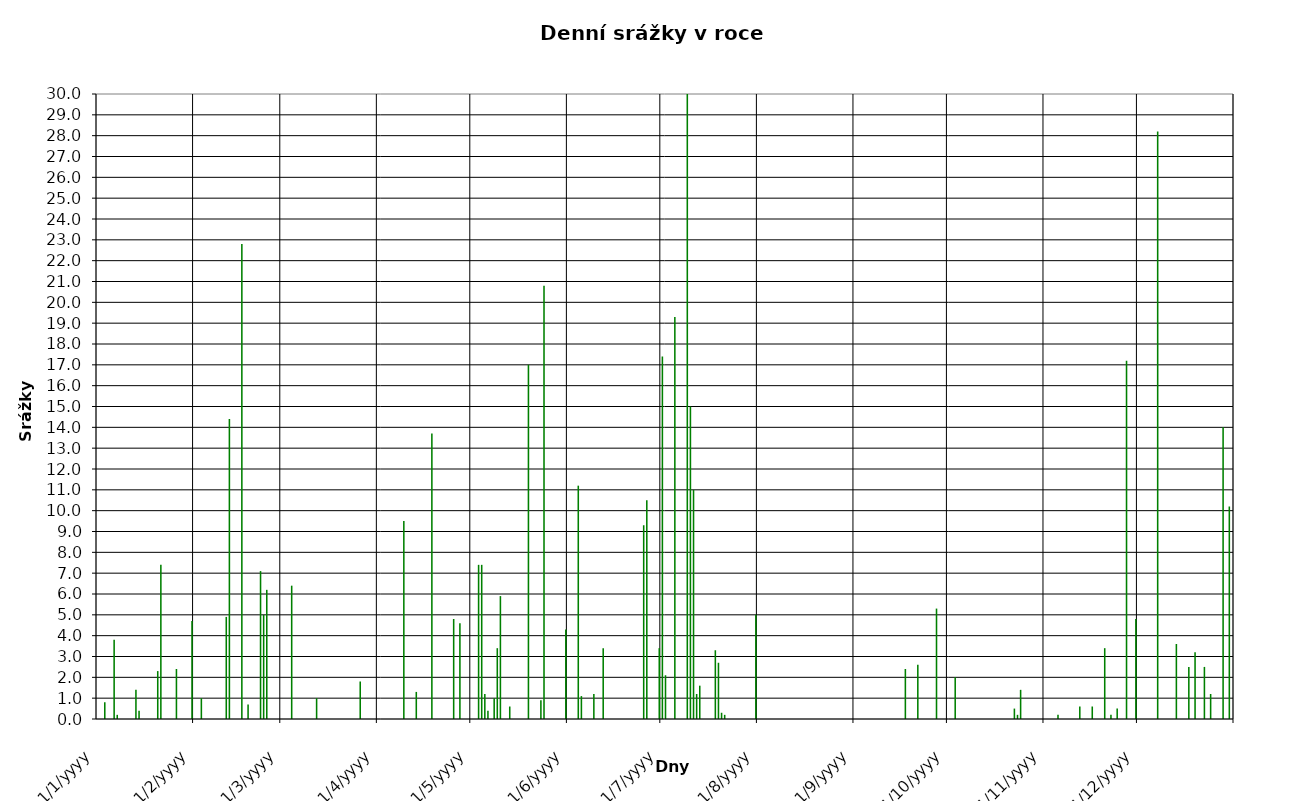
| Category | Series 0 |
|---|---|
| 2005-01-01 | 0 |
| 2005-01-02 | 0 |
| 2005-01-03 | 0.8 |
| 2005-01-04 | 0 |
| 2005-01-05 | 0 |
| 2005-01-06 | 3.8 |
| 2005-01-07 | 0.2 |
| 2005-01-08 | 0 |
| 2005-01-09 | 0 |
| 2005-01-10 | 0 |
| 2005-01-11 | 0 |
| 2005-01-12 | 0 |
| 2005-01-13 | 1.4 |
| 2005-01-14 | 0.4 |
| 2005-01-15 | 0 |
| 2005-01-16 | 0 |
| 2005-01-17 | 0 |
| 2005-01-18 | 0 |
| 2005-01-19 | 0 |
| 2005-01-20 | 2.3 |
| 2005-01-21 | 7.4 |
| 2005-01-22 | 0 |
| 2005-01-23 | 0 |
| 2005-01-24 | 0 |
| 2005-01-25 | 0 |
| 2005-01-26 | 2.4 |
| 2005-01-27 | 0 |
| 2005-01-28 | 0 |
| 2005-01-29 | 0 |
| 2005-01-30 | 0 |
| 2005-01-31 | 4.7 |
| 2005-02-01 | 0 |
| 2005-02-02 | 0 |
| 2005-02-03 | 1 |
| 2005-02-04 | 0 |
| 2005-02-05 | 0 |
| 2005-02-06 | 0 |
| 2005-02-07 | 0 |
| 2005-02-08 | 0 |
| 2005-02-09 | 0 |
| 2005-02-10 | 0 |
| 2005-02-11 | 4.9 |
| 2005-02-12 | 14.4 |
| 2005-02-13 | 0 |
| 2005-02-14 | 0 |
| 2005-02-15 | 0 |
| 2005-02-16 | 22.8 |
| 2005-02-17 | 0 |
| 2005-02-18 | 0.7 |
| 2005-02-19 | 0 |
| 2005-02-20 | 0 |
| 2005-02-21 | 0 |
| 2005-02-22 | 7.1 |
| 2005-02-23 | 5 |
| 2005-02-24 | 6.2 |
| 2005-02-25 | 0 |
| 2005-02-26 | 0 |
| 2005-02-27 | 0 |
| 2005-02-28 | 0 |
| 2005-03-01 | 0 |
| 2005-03-02 | 0 |
| 2005-03-03 | 0 |
| 2005-03-04 | 6.4 |
| 2005-03-05 | 0 |
| 2005-03-06 | 0 |
| 2005-03-07 | 0 |
| 2005-03-08 | 0 |
| 2005-03-09 | 0 |
| 2005-03-10 | 0 |
| 2005-03-11 | 0 |
| 2005-03-12 | 1 |
| 2005-03-13 | 0 |
| 2005-03-14 | 0 |
| 2005-03-15 | 0 |
| 2005-03-16 | 0 |
| 2005-03-17 | 0 |
| 2005-03-18 | 0 |
| 2005-03-19 | 0 |
| 2005-03-20 | 0 |
| 2005-03-21 | 0 |
| 2005-03-22 | 0 |
| 2005-03-23 | 0 |
| 2005-03-24 | 0 |
| 2005-03-25 | 0 |
| 2005-03-26 | 1.8 |
| 2005-03-27 | 0 |
| 2005-03-28 | 0 |
| 2005-03-29 | 0 |
| 2005-03-30 | 0 |
| 2005-03-31 | 0 |
| 2005-04-01 | 0 |
| 2005-04-02 | 0 |
| 2005-04-03 | 0 |
| 2005-04-04 | 0 |
| 2005-04-05 | 0 |
| 2005-04-06 | 0 |
| 2005-04-07 | 0 |
| 2005-04-08 | 0 |
| 2005-04-09 | 9.5 |
| 2005-04-10 | 0 |
| 2005-04-11 | 0 |
| 2005-04-12 | 0 |
| 2005-04-13 | 1.3 |
| 2005-04-14 | 0 |
| 2005-04-15 | 0 |
| 2005-04-16 | 0 |
| 2005-04-17 | 0 |
| 2005-04-18 | 13.7 |
| 2005-04-19 | 0 |
| 2005-04-20 | 0 |
| 2005-04-21 | 0 |
| 2005-04-22 | 0 |
| 2005-04-23 | 0 |
| 2005-04-24 | 0 |
| 2005-04-25 | 4.8 |
| 2005-04-26 | 0 |
| 2005-04-27 | 4.6 |
| 2005-04-28 | 0 |
| 2005-04-29 | 0 |
| 2005-04-30 | 0 |
| 2005-05-01 | 0 |
| 2005-05-02 | 0 |
| 2005-05-03 | 7.4 |
| 2005-05-04 | 7.4 |
| 2005-05-05 | 1.2 |
| 2005-05-06 | 0.4 |
| 2005-05-07 | 0 |
| 2005-05-08 | 1 |
| 2005-05-09 | 3.4 |
| 2005-05-10 | 5.9 |
| 2005-05-11 | 0 |
| 2005-05-12 | 0 |
| 2005-05-13 | 0.6 |
| 2005-05-14 | 0 |
| 2005-05-15 | 0 |
| 2005-05-16 | 0 |
| 2005-05-17 | 0 |
| 2005-05-18 | 0 |
| 2005-05-19 | 17 |
| 2005-05-20 | 0 |
| 2005-05-21 | 0 |
| 2005-05-22 | 0 |
| 2005-05-23 | 0.9 |
| 2005-05-24 | 20.8 |
| 2005-05-25 | 0 |
| 2005-05-26 | 0 |
| 2005-05-27 | 0 |
| 2005-05-28 | 0 |
| 2005-05-29 | 0 |
| 2005-05-30 | 0 |
| 2005-05-31 | 4.3 |
| 2005-06-01 | 0 |
| 2005-06-02 | 0 |
| 2005-06-03 | 0 |
| 2005-06-04 | 11.2 |
| 2005-06-05 | 1.1 |
| 2005-06-06 | 0 |
| 2005-06-07 | 0 |
| 2005-06-08 | 0 |
| 2005-06-09 | 1.2 |
| 2005-06-10 | 0 |
| 2005-06-11 | 0 |
| 2005-06-12 | 3.4 |
| 2005-06-13 | 0 |
| 2005-06-14 | 0 |
| 2005-06-15 | 0 |
| 2005-06-16 | 0 |
| 2005-06-17 | 0 |
| 2005-06-18 | 0 |
| 2005-06-19 | 0 |
| 2005-06-20 | 0 |
| 2005-06-21 | 0 |
| 2005-06-22 | 0 |
| 2005-06-23 | 0 |
| 2005-06-24 | 0 |
| 2005-06-25 | 9.3 |
| 2005-06-26 | 10.5 |
| 2005-06-27 | 0 |
| 2005-06-28 | 0 |
| 2005-06-29 | 0 |
| 2005-06-30 | 3.4 |
| 2005-07-01 | 17.4 |
| 2005-07-02 | 2.1 |
| 2005-07-03 | 0 |
| 2005-07-04 | 0 |
| 2005-07-05 | 19.3 |
| 2005-07-06 | 0 |
| 2005-07-07 | 0 |
| 2005-07-08 | 0 |
| 2005-07-09 | 30 |
| 2005-07-10 | 15 |
| 2005-07-11 | 11 |
| 2005-07-12 | 1.2 |
| 2005-07-13 | 1.6 |
| 2005-07-14 | 0 |
| 2005-07-15 | 0 |
| 2005-07-16 | 0 |
| 2005-07-17 | 0 |
| 2005-07-18 | 3.3 |
| 2005-07-19 | 2.7 |
| 2005-07-20 | 0.3 |
| 2005-07-21 | 0.2 |
| 2005-07-22 | 0 |
| 2005-07-23 | 0 |
| 2005-07-24 | 0 |
| 2005-07-25 | 0 |
| 2005-07-26 | 0 |
| 2005-07-27 | 0 |
| 2005-07-28 | 0 |
| 2005-07-29 | 0 |
| 2005-07-30 | 0 |
| 2005-07-31 | 5 |
| 2005-08-01 | 0 |
| 2004-08-02 | 0 |
| 2004-08-03 | 12.4 |
| 2004-08-04 | 1.4 |
| 2004-08-05 | 0 |
| 2004-08-06 | 0 |
| 2004-08-07 | 0 |
| 2004-08-08 | 0 |
| 2004-08-09 | 0 |
| 2004-08-10 | 0 |
| 2004-08-11 | 0 |
| 2004-08-12 | 0 |
| 2004-08-13 | 0 |
| 2004-08-14 | 0 |
| 2004-08-15 | 22.8 |
| 2004-08-16 | 24.6 |
| 2004-08-17 | 0.1 |
| 2004-08-18 | 0 |
| 2004-08-19 | 0 |
| 2004-08-20 | 0 |
| 2004-08-21 | 0 |
| 2004-08-22 | 15.8 |
| 2004-08-23 | 0 |
| 2004-08-24 | 4.1 |
| 2004-08-25 | 0 |
| 2004-08-26 | 0.1 |
| 2004-08-27 | 0 |
| 2004-08-28 | 2.4 |
| 2004-08-29 | 0 |
| 2004-08-30 | 0 |
| 2004-08-31 | 0 |
| 2005-09-01 | 0 |
| 2005-09-02 | 0 |
| 2005-09-03 | 0 |
| 2005-09-04 | 0 |
| 2005-09-05 | 0 |
| 2005-09-06 | 0 |
| 2005-09-07 | 0 |
| 2005-09-08 | 0 |
| 2005-09-09 | 0 |
| 2005-09-10 | 0 |
| 2005-09-11 | 0 |
| 2005-09-12 | 0 |
| 2005-09-13 | 0 |
| 2005-09-14 | 0 |
| 2005-09-15 | 0 |
| 2005-09-16 | 0 |
| 2005-09-17 | 2.4 |
| 2005-09-18 | 0 |
| 2005-09-19 | 0 |
| 2005-09-20 | 0 |
| 2005-09-21 | 2.6 |
| 2005-09-22 | 0 |
| 2005-09-23 | 0 |
| 2005-09-24 | 0 |
| 2005-09-25 | 0 |
| 2005-09-26 | 0 |
| 2005-09-27 | 5.3 |
| 2005-09-28 | 0 |
| 2005-09-29 | 0 |
| 2005-09-30 | 0 |
| 2005-10-01 | 0 |
| 2005-10-02 | 0 |
| 2005-10-03 | 2 |
| 2005-10-04 | 0 |
| 2005-10-05 | 0 |
| 2005-10-06 | 0 |
| 2005-10-07 | 0 |
| 2005-10-08 | 0 |
| 2005-10-09 | 0 |
| 2005-10-10 | 0 |
| 2005-10-11 | 0 |
| 2005-10-12 | 0 |
| 2005-10-13 | 0 |
| 2005-10-14 | 0 |
| 2005-10-15 | 0 |
| 2005-10-16 | 0 |
| 2005-10-17 | 0 |
| 2005-10-18 | 0 |
| 2005-10-19 | 0 |
| 2005-10-20 | 0 |
| 2005-10-21 | 0 |
| 2005-10-22 | 0.5 |
| 2005-10-23 | 0.2 |
| 2005-10-24 | 1.4 |
| 2005-10-25 | 0 |
| 2005-10-26 | 0 |
| 2005-10-27 | 0 |
| 2005-10-28 | 0 |
| 2005-10-29 | 0 |
| 2005-10-30 | 0 |
| 2005-10-31 | 0 |
| 2005-11-01 | 0 |
| 2005-11-02 | 0 |
| 2005-11-03 | 0 |
| 2005-11-04 | 0 |
| 2005-11-05 | 0.2 |
| 2005-11-06 | 0 |
| 2005-11-07 | 0 |
| 2005-11-08 | 0 |
| 2005-11-09 | 0 |
| 2005-11-10 | 0 |
| 2005-11-11 | 0 |
| 2005-11-12 | 0.6 |
| 2005-11-13 | 0 |
| 2005-11-14 | 0 |
| 2005-11-15 | 0 |
| 2005-11-16 | 0.6 |
| 2005-11-17 | 0 |
| 2005-11-18 | 0 |
| 2005-11-19 | 0 |
| 2005-11-20 | 3.4 |
| 2005-11-21 | 0 |
| 2005-11-22 | 0.2 |
| 2005-11-23 | 0 |
| 2005-11-24 | 0.5 |
| 2005-11-25 | 0 |
| 2005-11-26 | 0 |
| 2005-11-27 | 17.2 |
| 2005-11-28 | 0 |
| 2005-11-29 | 0 |
| 2005-11-30 | 4.8 |
| 2005-12-01 | 0 |
| 2005-12-02 | 0 |
| 2005-12-03 | 0 |
| 2005-12-04 | 0 |
| 2005-12-05 | 0 |
| 2005-12-06 | 0 |
| 2005-12-07 | 28.2 |
| 2005-12-08 | 0 |
| 2005-12-09 | 0 |
| 2005-12-10 | 0 |
| 2005-12-11 | 0 |
| 2005-12-12 | 0 |
| 2005-12-13 | 3.6 |
| 2005-12-14 | 0 |
| 2005-12-15 | 0 |
| 2005-12-16 | 0 |
| 2005-12-17 | 2.5 |
| 2005-12-18 | 0 |
| 2005-12-19 | 3.2 |
| 2005-12-20 | 0 |
| 2005-12-21 | 0 |
| 2005-12-22 | 2.5 |
| 2005-12-23 | 0 |
| 2005-12-24 | 1.2 |
| 2005-12-25 | 0 |
| 2005-12-26 | 0 |
| 2005-12-27 | 0 |
| 2005-12-28 | 14 |
| 2005-12-29 | 0 |
| 2005-12-30 | 10.2 |
| 2005-12-31 | 0 |